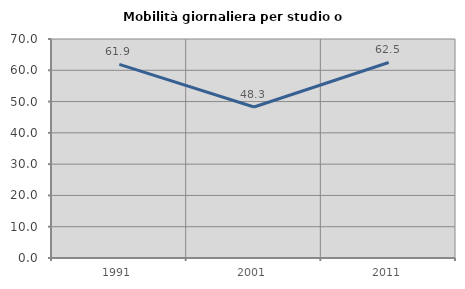
| Category | Mobilità giornaliera per studio o lavoro |
|---|---|
| 1991.0 | 61.905 |
| 2001.0 | 48.276 |
| 2011.0 | 62.5 |